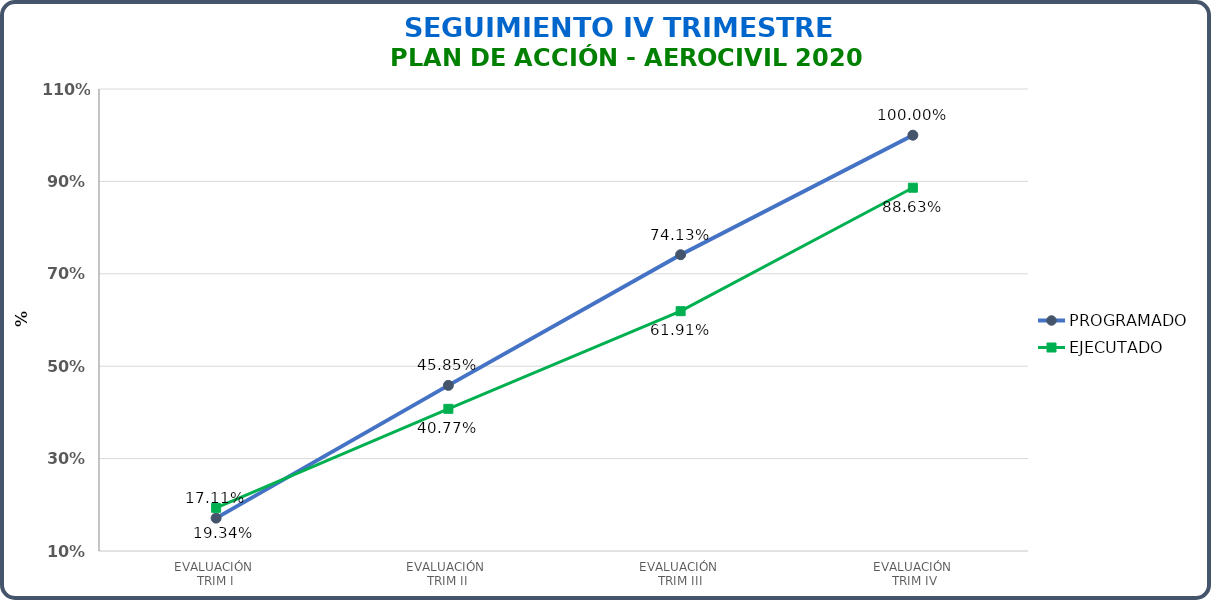
| Category | PROGRAMADO | EJECUTADO |
|---|---|---|
| EVALUACIÓN 
TRIM I | 0.171 | 0.193 |
| EVALUACIÓN 
TRIM II | 0.459 | 0.408 |
| EVALUACIÓN 
TRIM III | 0.741 | 0.619 |
| EVALUACIÓN
 TRIM IV | 1 | 0.886 |